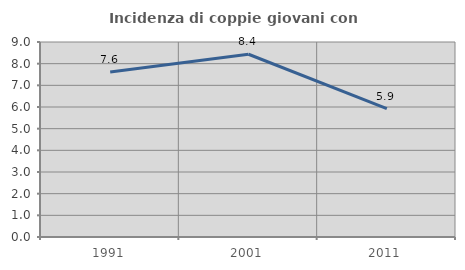
| Category | Incidenza di coppie giovani con figli |
|---|---|
| 1991.0 | 7.614 |
| 2001.0 | 8.434 |
| 2011.0 | 5.926 |